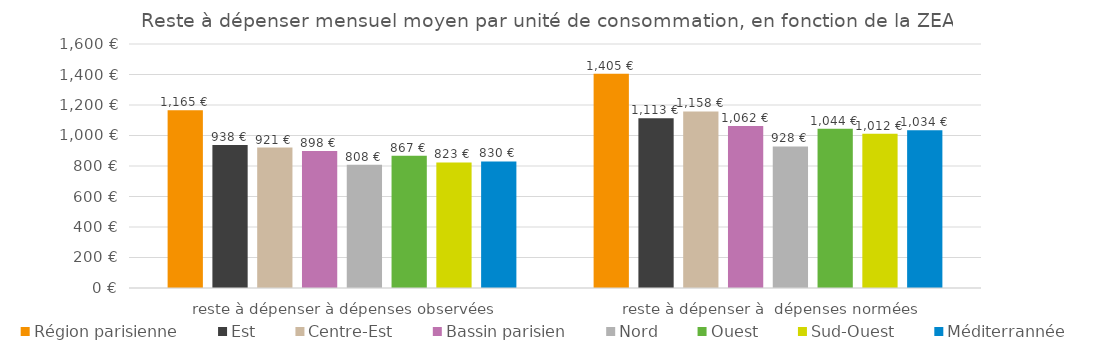
| Category | Région parisienne | Est | Centre-Est | Bassin parisien | Nord | Ouest | Sud-Ouest | Méditerrannée |
|---|---|---|---|---|---|---|---|---|
| reste à dépenser à dépenses observées | 1165 | 938 | 921 | 898 | 808 | 867 | 823 | 830 |
| reste à dépenser à  dépenses normées | 1405 | 1113 | 1158 | 1062 | 928 | 1044 | 1012 | 1034 |